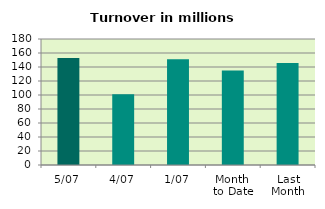
| Category | Series 0 |
|---|---|
| 5/07 | 152.92 |
| 4/07 | 100.991 |
| 1/07 | 151.239 |
| Month 
to Date | 135.05 |
| Last
Month | 145.879 |